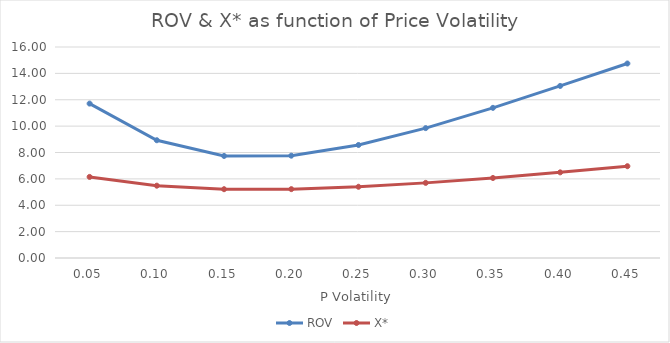
| Category | ROV | X* |
|---|---|---|
| 0.05 | 11.709 | 6.149 |
| 0.1 | 8.93 | 5.484 |
| 0.15000000000000002 | 7.738 | 5.216 |
| 0.2 | 7.759 | 5.221 |
| 0.25 | 8.57 | 5.402 |
| 0.3 | 9.849 | 5.697 |
| 0.35 | 11.387 | 6.068 |
| 0.39999999999999997 | 13.047 | 6.494 |
| 0.44999999999999996 | 14.748 | 6.96 |